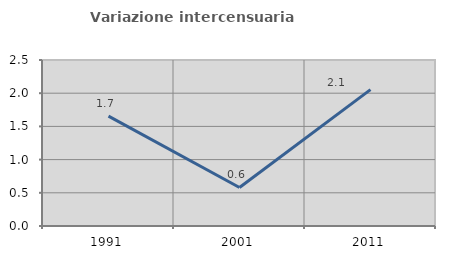
| Category | Variazione intercensuaria annua |
|---|---|
| 1991.0 | 1.655 |
| 2001.0 | 0.581 |
| 2011.0 | 2.054 |